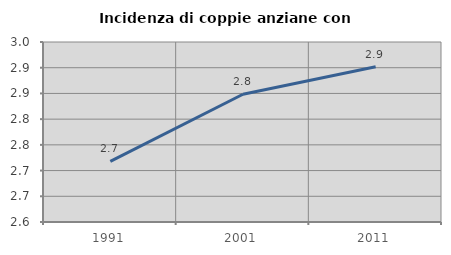
| Category | Incidenza di coppie anziane con figli |
|---|---|
| 1991.0 | 2.718 |
| 2001.0 | 2.848 |
| 2011.0 | 2.902 |